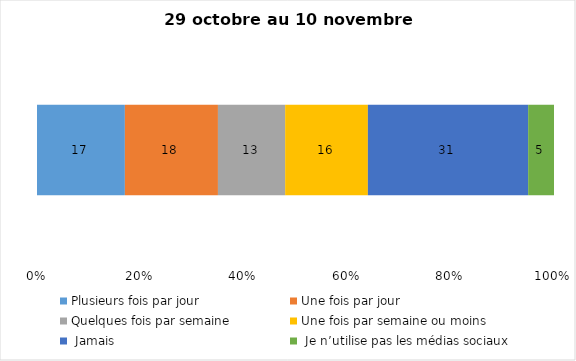
| Category | Plusieurs fois par jour | Une fois par jour | Quelques fois par semaine   | Une fois par semaine ou moins   |  Jamais   |  Je n’utilise pas les médias sociaux |
|---|---|---|---|---|---|---|
| 0 | 17 | 18 | 13 | 16 | 31 | 5 |